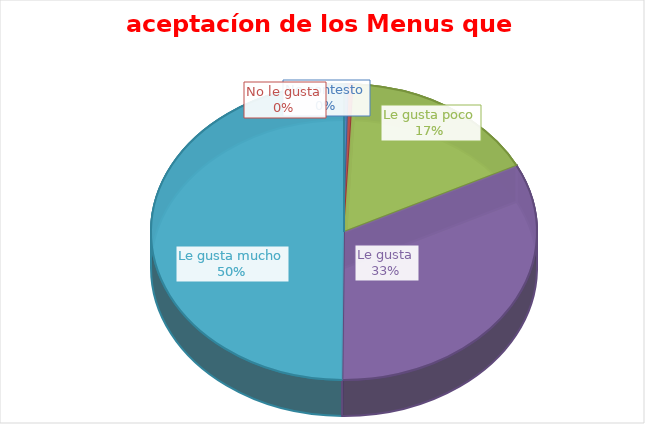
| Category | Series 0 |
|---|---|
| No contesto | 1 |
| No le gusta | 1 |
| Le gusta poco | 42.571 |
| Le gusta | 82.286 |
| Le gusta mucho | 126.143 |